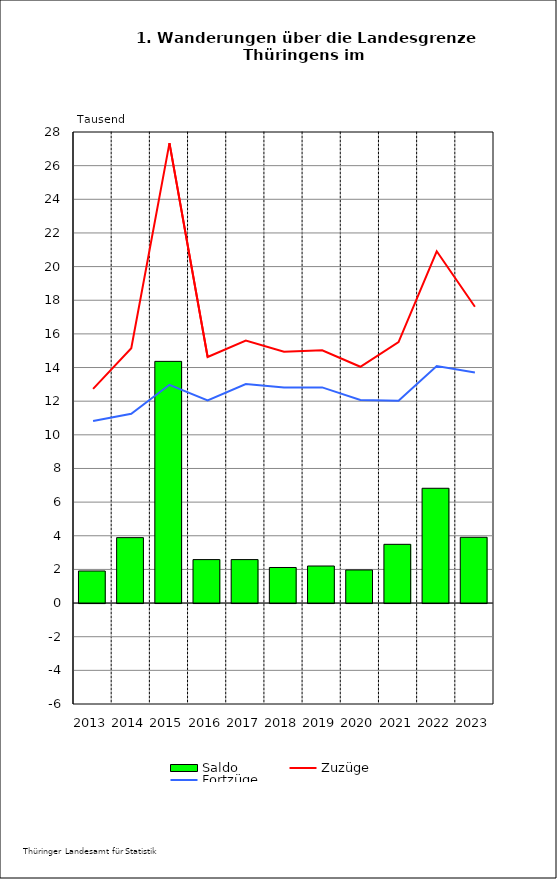
| Category | Saldo |
|---|---|
| 2013.0 | 1.906 |
| 2014.0 | 3.889 |
| 2015.0 | 14.366 |
| 2016.0 | 2.583 |
| 2017.0 | 2.583 |
| 2018.0 | 2.114 |
| 2019.0 | 2.202 |
| 2020.0 | 1.967 |
| 2021.0 | 3.491 |
| 2022.0 | 6.823 |
| 2023.0 | 3.909 |